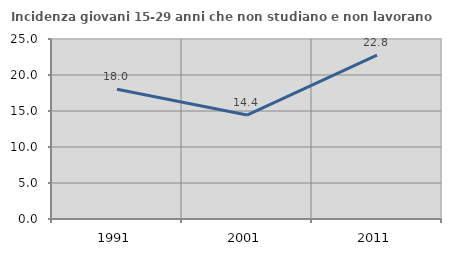
| Category | Incidenza giovani 15-29 anni che non studiano e non lavorano  |
|---|---|
| 1991.0 | 18.029 |
| 2001.0 | 14.439 |
| 2011.0 | 22.764 |